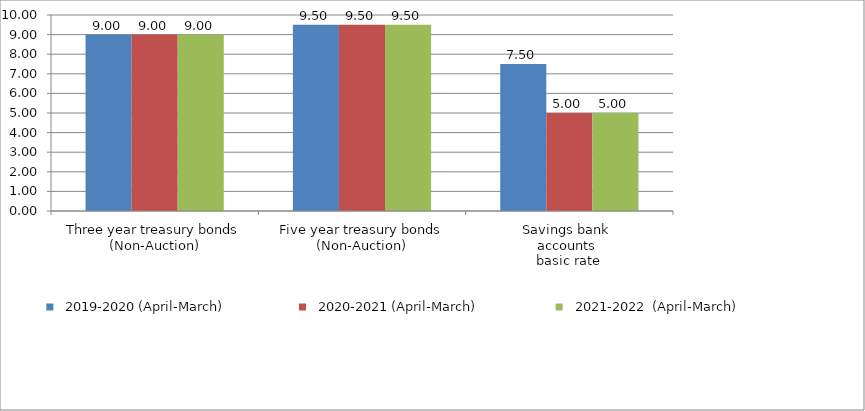
| Category |   2019-2020 (April-March) |   2020-2021 (April-March)  |   2021-2022  (April-March)
 |
|---|---|---|---|
| Three year treasury bonds
(Non-Auction) | 9 | 9 | 9 |
| Five year treasury bonds
(Non-Auction) | 9.5 | 9.5 | 9.5 |
| Savings bank 
accounts 
basic rate | 7.5 | 5 | 5 |